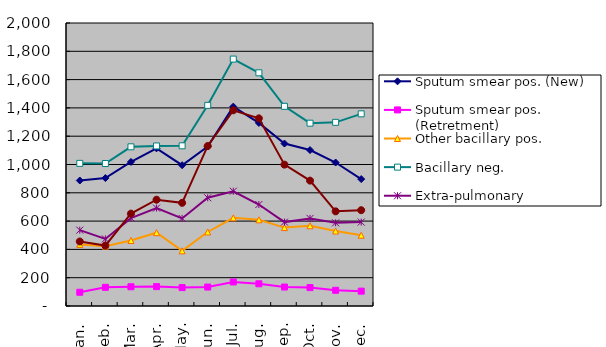
| Category | Sputum smear pos. (New) | Sputum smear pos. (Retretment) | Other bacillary pos. | Bacillary neg. | Extra-pulmonary | Chemopro-phylaxis* |
|---|---|---|---|---|---|---|
| Jan. | 887 | 97 | 435 | 1008 | 536 | 456 |
| Feb. | 904 | 132 | 423 | 1007 | 474 | 427 |
| Mar. | 1018 | 136 | 463 | 1125 | 621 | 653 |
| Apr. | 1114 | 137 | 518 | 1131 | 692 | 751 |
| May. | 995 | 130 | 390 | 1132 | 619 | 729 |
| Jun. | 1127 | 134 | 523 | 1418 | 765 | 1131 |
| Jul. | 1409 | 170 | 623 | 1745 | 811 | 1383 |
| Aug. | 1294 | 157 | 609 | 1648 | 717 | 1326 |
| Sep. | 1148 | 134 | 554 | 1411 | 593 | 999 |
| Oct. | 1102 | 130 | 567 | 1292 | 619 | 886 |
| Nov. | 1014 | 111 | 530 | 1298 | 588 | 669 |
| Dec. | 897 | 105 | 500 | 1358 | 593 | 677 |